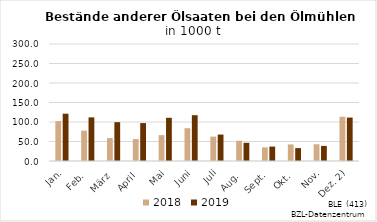
| Category | 2018 | 2019 |
|---|---|---|
| Jan. | 102.193 | 121.285 |
| Feb. | 77.703 | 111.865 |
| März | 58.626 | 99.587 |
| April | 56.17 | 97.271 |
| Mai | 66.375 | 110.764 |
| Juni | 84.124 | 117.475 |
| Juli | 62.53 | 67.796 |
| Aug. | 51.886 | 46.603 |
| Sept. | 35.069 | 36.986 |
| Okt. | 42.476 | 33.047 |
| Nov. | 42.882 | 38.646 |
| Dez. 2) | 113.53 | 111.355 |